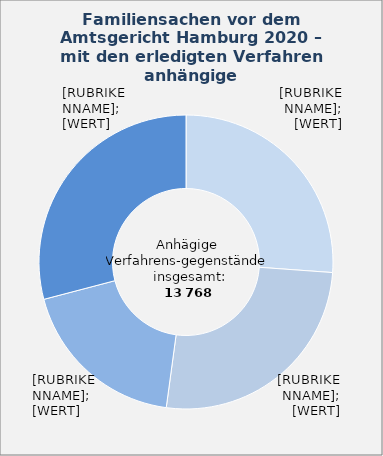
| Category | in Prozent |
|---|---|
| Versorgungsausgleich | 26.148 |
| Scheidung | 26.002 |
| Elterliche Sorge | 18.761 |
| Übrige Verfahrensgegenstände¹ | 29.089 |